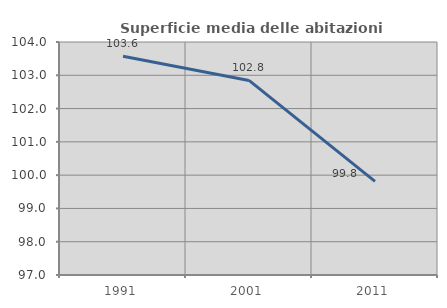
| Category | Superficie media delle abitazioni occupate |
|---|---|
| 1991.0 | 103.573 |
| 2001.0 | 102.845 |
| 2011.0 | 99.811 |